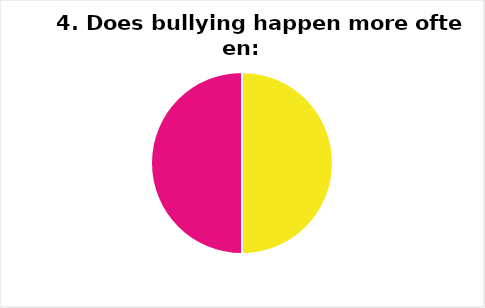
| Category | Field1 |
|---|---|
| In front of adults | 1 |
| When adults aren’t around | 1 |